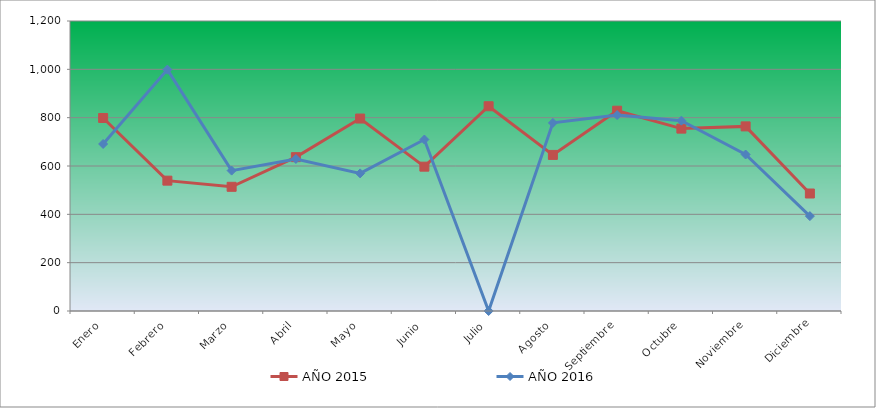
| Category | AÑO 2015 | AÑO 2016 |
|---|---|---|
| Enero | 798.686 | 691.157 |
| Febrero | 539.402 | 998.848 |
| Marzo | 513.937 | 580.939 |
| Abril | 636.634 | 629.16 |
| Mayo | 796.371 | 569.458 |
| Junio | 597.278 | 709.527 |
| Julio | 847.302 | 0 |
| Agosto | 645.894 | 778.413 |
| Septiembre | 828.781 | 810.56 |
| Octubre | 754.7 | 787.598 |
| Noviembre | 763.96 | 647.529 |
| Diciembre | 486.157 | 392.651 |